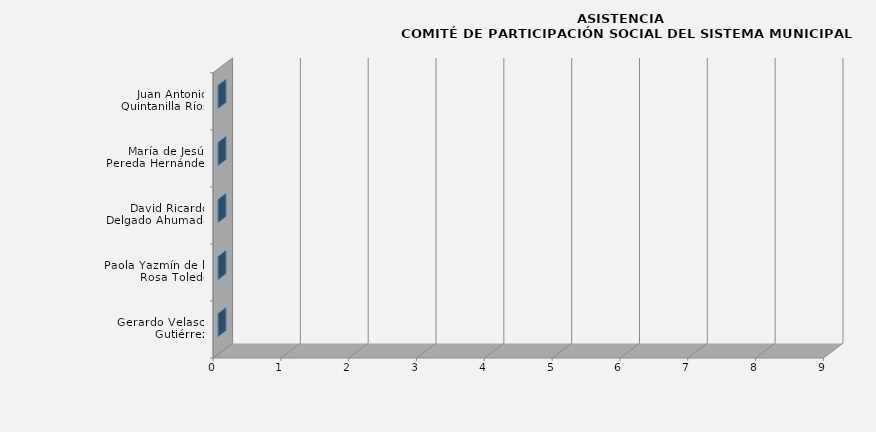
| Category | Series 0 |
|---|---|
| Gerardo Velasco Gutiérrez | 0 |
| Paola Yazmín de la Rosa Toledo | 0 |
| David Ricardo Delgado Ahumada | 0 |
| María de Jesús Pereda Hernández | 0 |
| Juan Antonio Quintanilla Ríos | 0 |